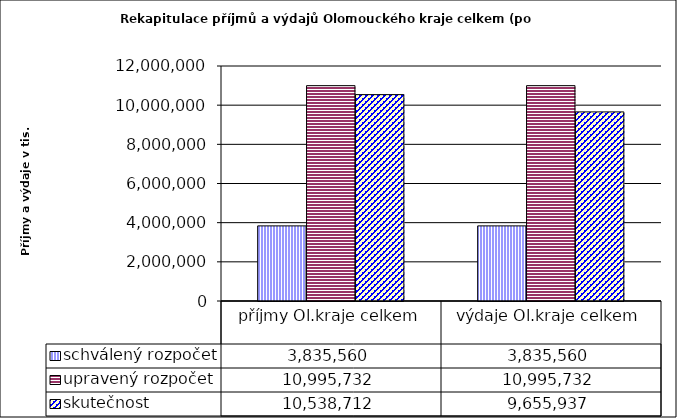
| Category | schválený rozpočet | upravený rozpočet | skutečnost |
|---|---|---|---|
| příjmy Ol.kraje celkem | 3835560 | 10995732 | 10538712 |
| výdaje Ol.kraje celkem | 3835560 | 10995732 | 9655937 |